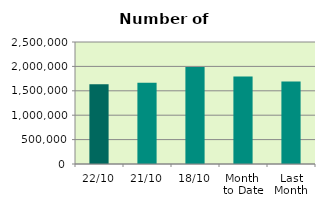
| Category | Series 0 |
|---|---|
| 22/10 | 1635406 |
| 21/10 | 1662498 |
| 18/10 | 1986948 |
| Month 
to Date | 1794348.125 |
| Last
Month | 1689477.048 |